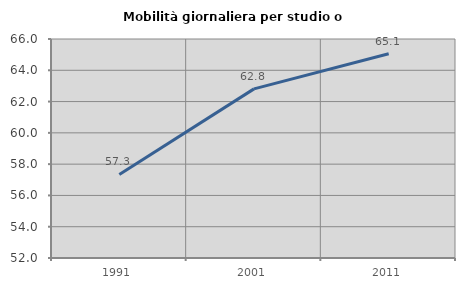
| Category | Mobilità giornaliera per studio o lavoro |
|---|---|
| 1991.0 | 57.342 |
| 2001.0 | 62.812 |
| 2011.0 | 65.053 |